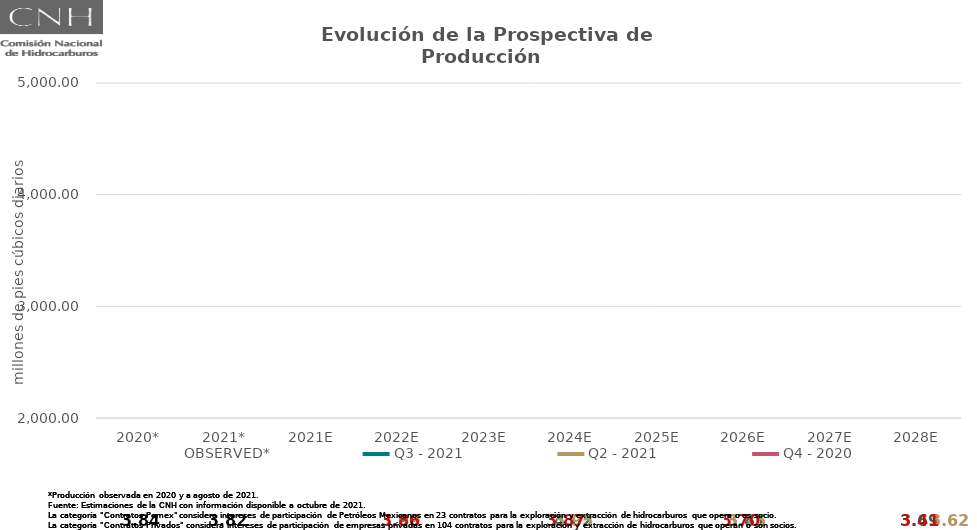
| Category | OBSERVED* | Q3 - 2021 | Q2 - 2021 | Q4 - 2020 |
|---|---|---|---|---|
| 2020* | 3.843 | 3.843 | 3.843 | 3.843 |
| 2021* | 3.818 | 3.818 | 3.818 | 3.818 |
| 2021E | 3.901 | 3.901 | 3.78 | 3.867 |
| 2022E | 3.897 | 3.897 | 3.693 | 3.865 |
| 2023E | 4.171 | 4.171 | 4.013 | 3.984 |
| 2024E | 4.02 | 4.02 | 3.947 | 3.874 |
| 2025E | 3.872 | 3.872 | 3.805 | 3.741 |
| 2026E | 3.809 | 3.809 | 3.746 | 3.705 |
| 2027E | 3.891 | 3.891 | 3.842 | 3.658 |
| 2028E | 3.687 | 3.687 | 3.618 | 3.407 |